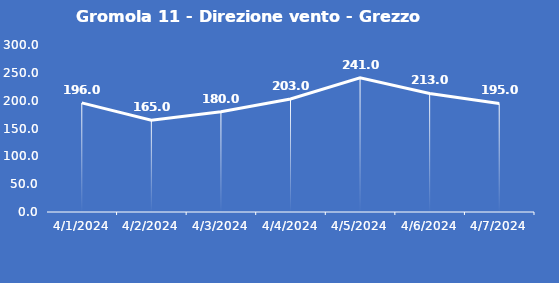
| Category | Gromola 11 - Direzione vento - Grezzo (°N) |
|---|---|
| 4/1/24 | 196 |
| 4/2/24 | 165 |
| 4/3/24 | 180 |
| 4/4/24 | 203 |
| 4/5/24 | 241 |
| 4/6/24 | 213 |
| 4/7/24 | 195 |